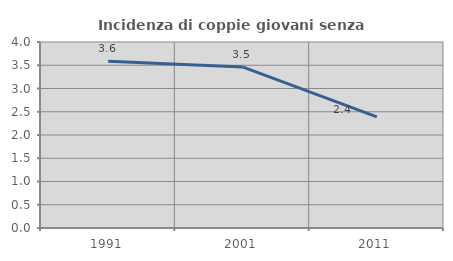
| Category | Incidenza di coppie giovani senza figli |
|---|---|
| 1991.0 | 3.584 |
| 2001.0 | 3.464 |
| 2011.0 | 2.39 |